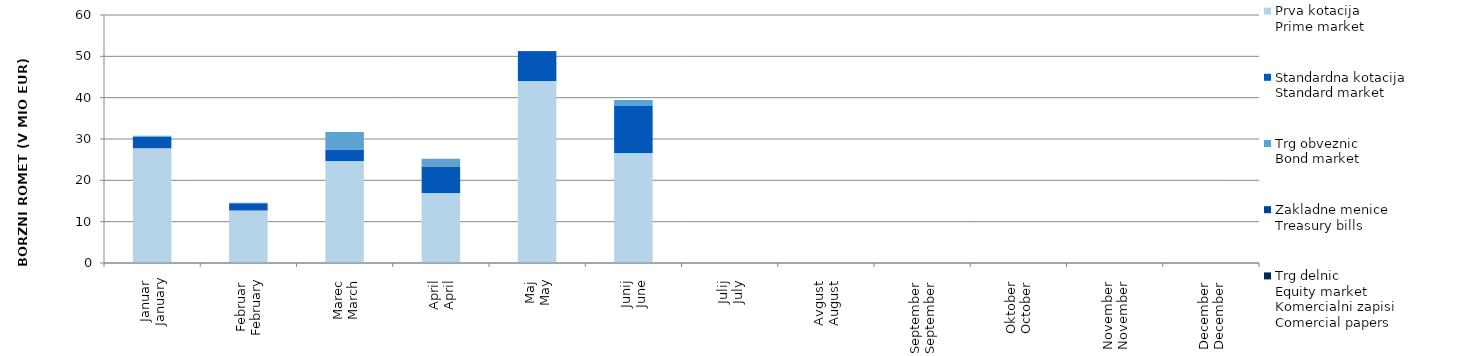
| Category | Prva kotacija
Prime market | Standardna kotacija
Standard market | Trg obveznic
Bond market | Zakladne menice
Treasury bills | Trg delnic
Equity market |
|---|---|---|---|---|---|
| Januar
January | 27.745 | 2.796 | 0.249 | 0 | 0 |
| Februar
February | 12.685 | 1.784 | 0.118 | 0 | 0 |
| Marec
March | 24.676 | 2.813 | 4.174 | 0 | 0 |
| April
April | 16.942 | 6.272 | 2.01 | 0 | 0 |
| Maj
May | 44.02 | 7.1 | 0 | 0.145 | 0 |
| Junij
June | 26.612 | 11.39 | 1.425 | 0 | 0 |
| Julij
July | 0 | 0 | 0 | 0 | 0 |
| Avgust
August | 0 | 0 | 0 | 0 | 0 |
| September
September | 0 | 0 | 0 | 0 | 0 |
| Oktober
October | 0 | 0 | 0 | 0 | 0 |
| November
November | 0 | 0 | 0 | 0 | 0 |
| December
December | 0 | 0 | 0 | 0 | 0 |